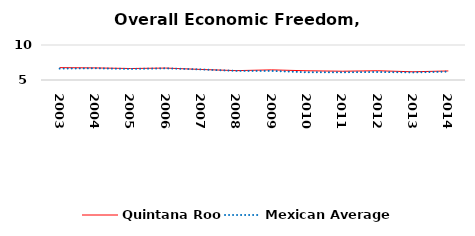
| Category | Quintana Roo | Mexican Average  |
|---|---|---|
| 2003.0 | 6.767 | 6.632 |
| 2004.0 | 6.727 | 6.678 |
| 2005.0 | 6.639 | 6.582 |
| 2006.0 | 6.705 | 6.668 |
| 2007.0 | 6.509 | 6.508 |
| 2008.0 | 6.338 | 6.3 |
| 2009.0 | 6.445 | 6.3 |
| 2010.0 | 6.316 | 6.105 |
| 2011.0 | 6.254 | 6.103 |
| 2012.0 | 6.321 | 6.144 |
| 2013.0 | 6.172 | 6.087 |
| 2014.0 | 6.294 | 6.195 |